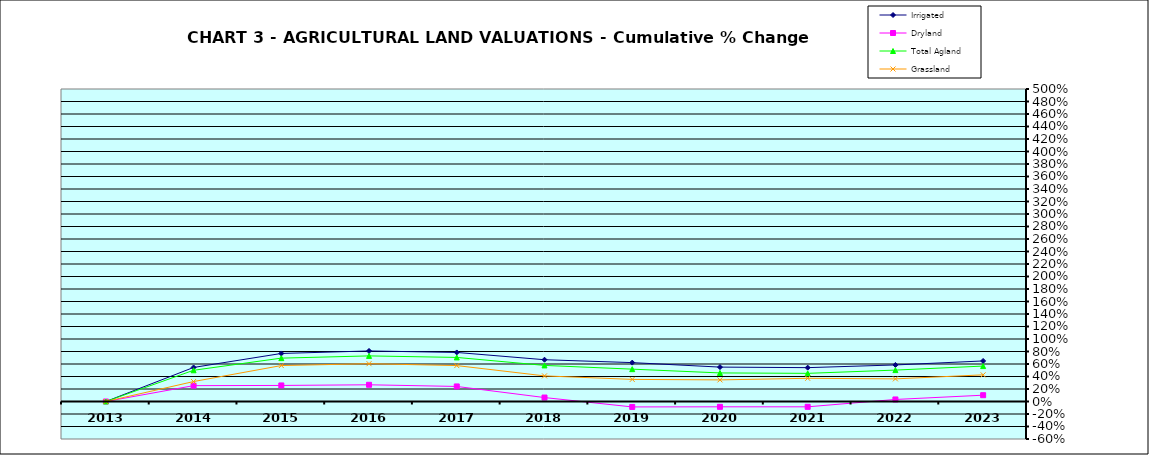
| Category | Irrigated | Dryland | Total Agland | Grassland |
|---|---|---|---|---|
| 2013.0 | 0 | 0 | 0 | 0 |
| 2014.0 | 0.545 | 0.254 | 0.5 | 0.319 |
| 2015.0 | 0.769 | 0.257 | 0.694 | 0.575 |
| 2016.0 | 0.809 | 0.267 | 0.73 | 0.605 |
| 2017.0 | 0.785 | 0.241 | 0.705 | 0.575 |
| 2018.0 | 0.668 | 0.063 | 0.577 | 0.41 |
| 2019.0 | 0.622 | -0.087 | 0.518 | 0.354 |
| 2020.0 | 0.55 | -0.085 | 0.457 | 0.346 |
| 2021.0 | 0.542 | -0.085 | 0.45 | 0.371 |
| 2022.0 | 0.585 | 0.033 | 0.503 | 0.362 |
| 2023.0 | 0.649 | 0.101 | 0.567 | 0.427 |